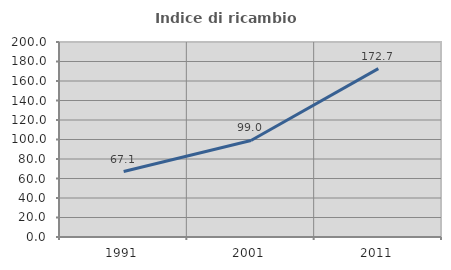
| Category | Indice di ricambio occupazionale  |
|---|---|
| 1991.0 | 67.13 |
| 2001.0 | 98.98 |
| 2011.0 | 172.662 |